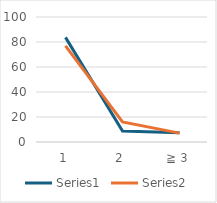
| Category | Series 0 | Series 1 |
|---|---|---|
| 1 | 83.706 | 76.865 |
| 2 | 8.85 | 16.033 |
| ≧ 3 | 7.444 | 7.102 |